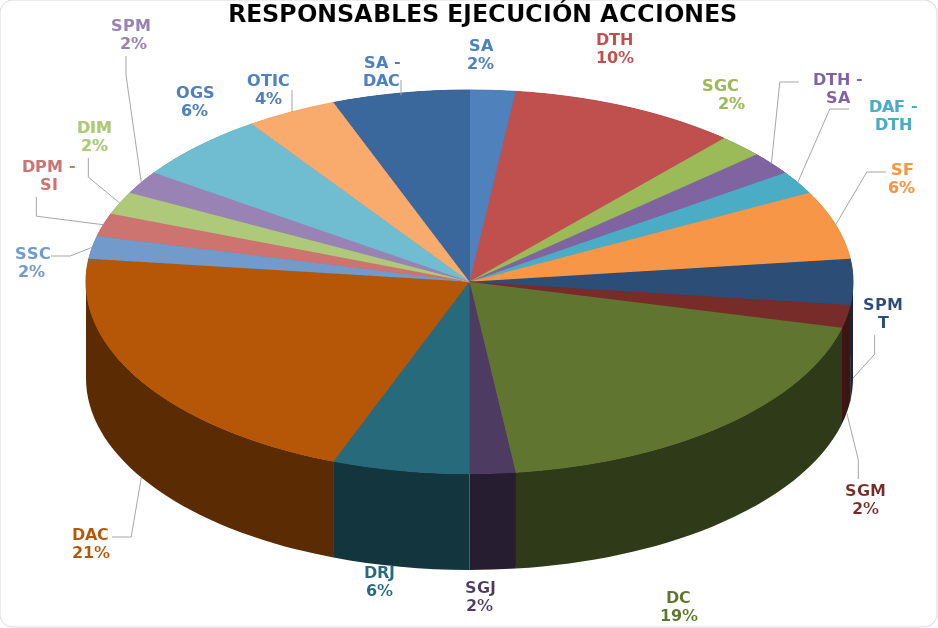
| Category | Series 0 |
|---|---|
| SA | 1 |
| DTH | 5 |
| SGC     | 1 |
| DTH - SA | 1 |
| DAF - DTH | 1 |
| SF | 3 |
| SPMT | 2 |
| SGM | 1 |
| DC | 10 |
| SGJ | 1 |
| DRJ | 3 |
| DAC | 11 |
| SSC | 1 |
| DPM - SI | 1 |
| DIM | 1 |
| SPM  | 1 |
| OGS | 3 |
| OTIC | 2 |
| SA - DAC | 3 |